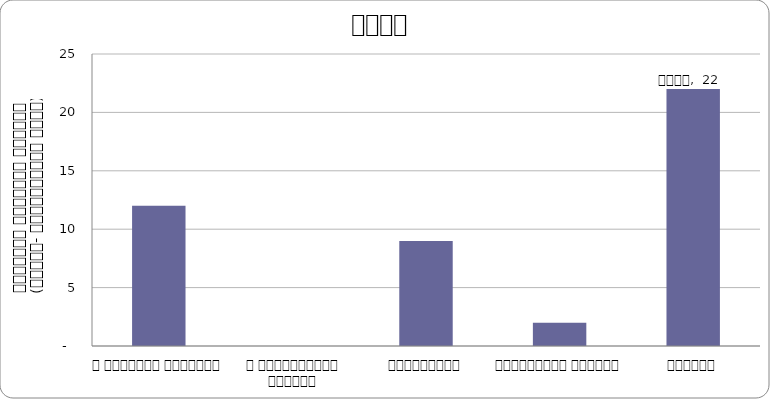
| Category | शासन |
|---|---|
| द हिमालयन टाइम्स् | 12 |
| द काठमाण्डौं पोस्ट् | 0 |
| कान्तिपुर | 9 |
| अन्नपूर्ण पोस्ट् | 2 |
| नागरिक | 22 |